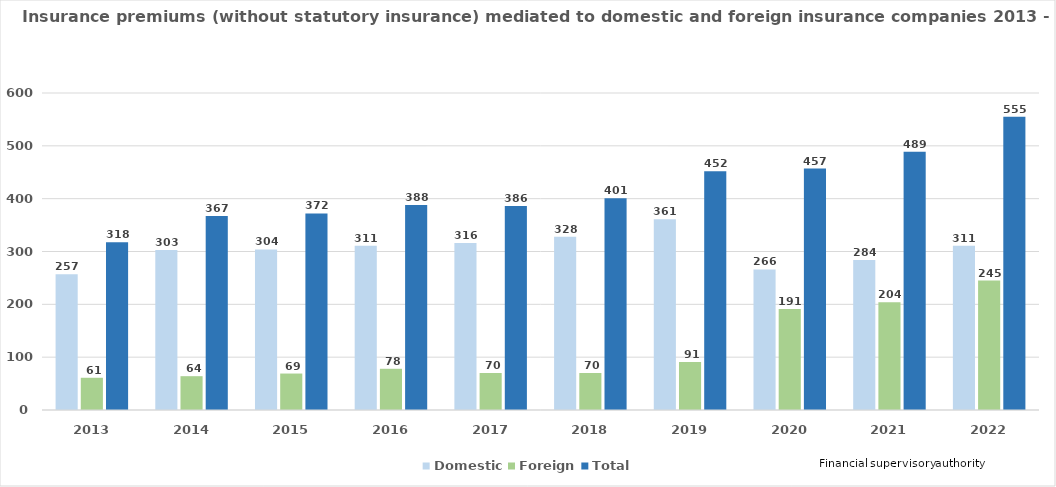
| Category | Domestic | Foreign | Total |
|---|---|---|---|
| 2013.0 | 257 | 61 | 317.523 |
| 2014.0 | 303 | 64 | 367 |
| 2015.0 | 304 | 69 | 372 |
| 2016.0 | 311 | 78 | 388 |
| 2017.0 | 316 | 70 | 386 |
| 2018.0 | 328 | 70 | 401 |
| 2019.0 | 361 | 91 | 452 |
| 2020.0 | 266 | 191 | 457 |
| 2021.0 | 284 | 204 | 489 |
| 2022.0 | 311 | 245 | 555 |